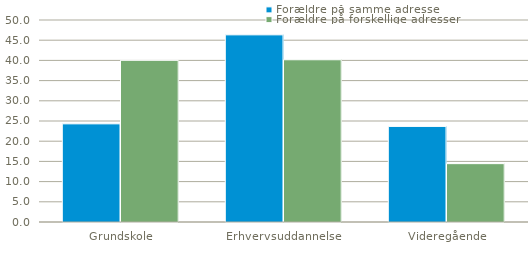
| Category | Forældre på samme adresse | Forældre på forskellige adresser |
|---|---|---|
| Grundskole | 24.296 | 40.021 |
| Erhvervsuddannelse | 46.325 | 40.159 |
| Videregående | 23.663 | 14.443 |